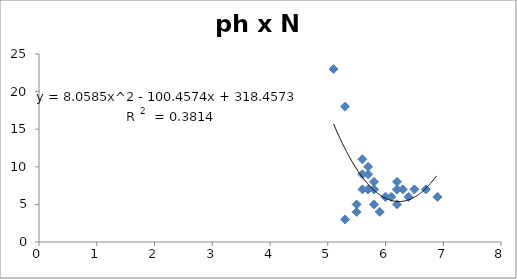
| Category | ph x N |
|---|---|
| 6.3 | 7 |
| 6.2 | 8 |
| 6.2 | 7 |
| 6.5 | 7 |
| 6.7 | 7 |
| 6.9 | 6 |
| 6.4 | 6 |
| 5.3 | 3 |
| 5.5 | 4 |
| 5.7 | 9 |
| 5.8 | 7 |
| 6.2 | 7 |
| 6.1 | 6 |
| 6.0 | 6 |
| 5.7 | 10 |
| 5.8 | 5 |
| 5.3 | 18 |
| 5.1 | 23 |
| 5.6 | 11 |
| 5.7 | 7 |
| 5.7 | 7 |
| 5.8 | 8 |
| 5.6 | 7 |
| 6.2 | 5 |
| 5.6 | 9 |
| 5.5 | 5 |
| 5.8 | 7 |
| 5.8 | 7 |
| 5.9 | 4 |
| 6.0 | 6 |